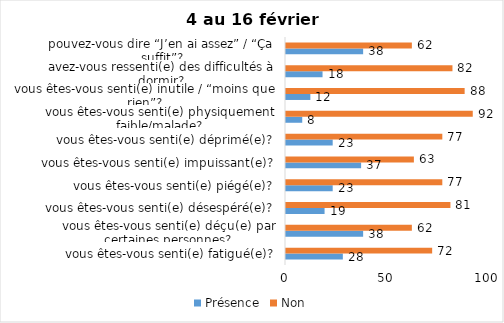
| Category | Présence | Non |
|---|---|---|
| vous êtes-vous senti(e) fatigué(e)? | 28 | 72 |
| vous êtes-vous senti(e) déçu(e) par certaines personnes? | 38 | 62 |
| vous êtes-vous senti(e) désespéré(e)? | 19 | 81 |
| vous êtes-vous senti(e) piégé(e)? | 23 | 77 |
| vous êtes-vous senti(e) impuissant(e)? | 37 | 63 |
| vous êtes-vous senti(e) déprimé(e)? | 23 | 77 |
| vous êtes-vous senti(e) physiquement faible/malade? | 8 | 92 |
| vous êtes-vous senti(e) inutile / “moins que rien”? | 12 | 88 |
| avez-vous ressenti(e) des difficultés à dormir? | 18 | 82 |
| pouvez-vous dire “J’en ai assez” / “Ça suffit”? | 38 | 62 |